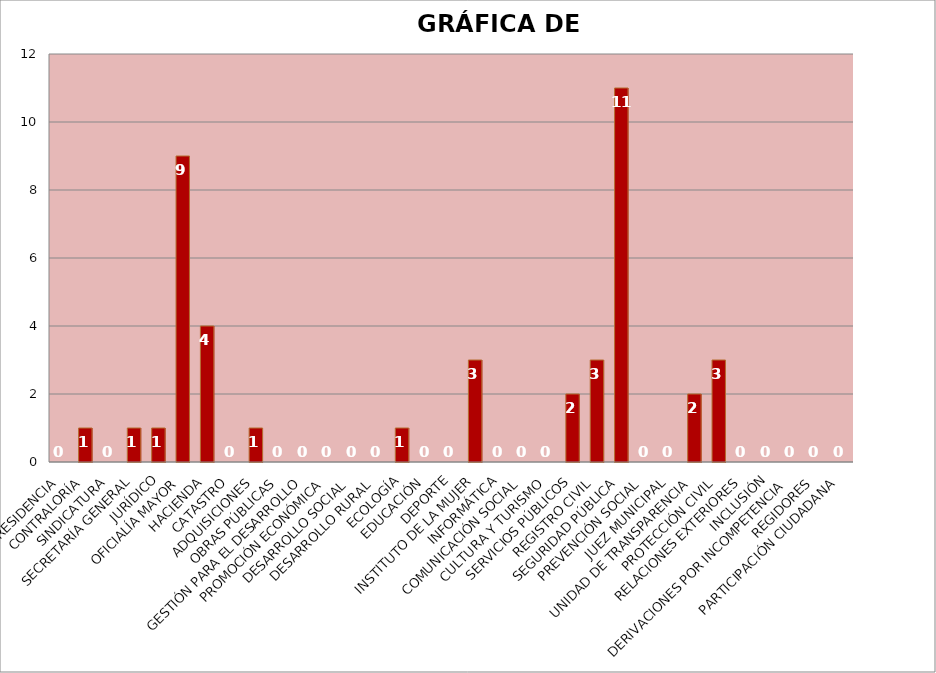
| Category | Series 0 |
|---|---|
| PRESIDENCIA | 0 |
| CONTRALORÍA | 1 |
| SINDICATURA | 0 |
| SECRETARÍA GENERAL | 1 |
| JURÍDICO | 1 |
| OFICIALÍA MAYOR | 9 |
| HACIENDA | 4 |
| CATASTRO | 0 |
| ADQUISICIONES | 1 |
| OBRAS PÚBLICAS | 0 |
| GESTIÓN PARA EL DESARROLLO | 0 |
| PROMOCIÓN ECONÓMICA | 0 |
| DESARROLLO SOCIAL | 0 |
| DESARROLLO RURAL | 0 |
| ECOLOGÍA | 1 |
| EDUCACIÓN | 0 |
| DEPORTE | 0 |
| INSTITUTO DE LA MUJER | 3 |
| INFORMÁTICA | 0 |
| COMUNICACIÓN SOCIAL | 0 |
| CULTURA Y TURISMO | 0 |
| SERVICIOS PÚBLICOS | 2 |
| REGISTRO CIVIL | 3 |
| SEGURIDAD PÚBLICA | 11 |
| PREVENCIÓN SOCIAL | 0 |
| JUEZ MUNICIPAL | 0 |
| UNIDAD DE TRANSPARENCIA | 2 |
| PROTECCIÓN CIVIL | 3 |
| RELACIONES EXTERIORES | 0 |
| INCLUSIÓN | 0 |
| DERIVACIONES POR INCOMPETENCIA | 0 |
| REGIDORES | 0 |
| PARTICIPACIÓN CIUDADANA | 0 |